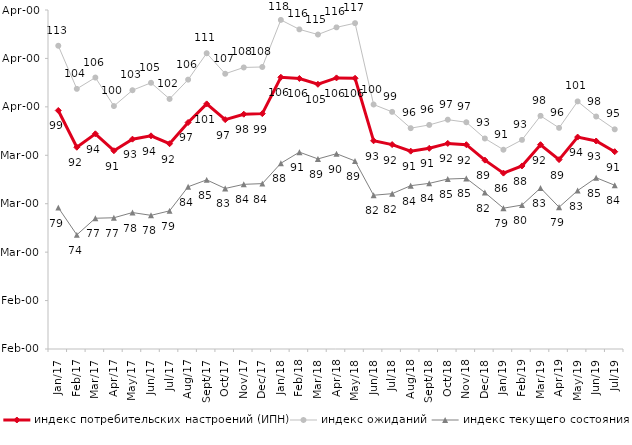
| Category | индекс потребительских настроений (ИПН) | Series 0 | индекс ожиданий | Series 3 | индекс текущего состояния |
|---|---|---|---|---|---|
| 2017-01-01 | 99.25 | 2017-01-01 | 112.617 | 2017-01-01 | 79.2 |
| 2017-02-01 | 91.66 | 2017-02-01 | 103.717 | 2017-02-01 | 73.575 |
| 2017-03-01 | 94.43 | 2017-03-01 | 106.05 | 2017-03-01 | 77 |
| 2017-04-01 | 90.94 | 2017-04-01 | 100.167 | 2017-04-01 | 77.1 |
| 2017-05-01 | 93.33 | 2017-05-01 | 103.433 | 2017-05-01 | 78.175 |
| 2017-06-01 | 94.02 | 2017-06-01 | 104.967 | 2017-06-01 | 77.6 |
| 2017-07-01 | 92.39 | 2017-07-01 | 101.633 | 2017-07-01 | 78.525 |
| 2017-08-01 | 96.77 | 2017-08-01 | 105.617 | 2017-08-01 | 83.5 |
| 2017-09-01 | 100.61 | 2017-09-01 | 111.067 | 2017-09-01 | 84.925 |
| 2017-10-01 | 97.36 | 2017-10-01 | 106.833 | 2017-10-01 | 83.15 |
| 2017-11-01 | 98.48 | 2017-11-01 | 108.133 | 2017-11-01 | 84 |
| 2017-12-01 | 98.6 | 2017-12-01 | 108.233 | 2017-12-01 | 84.15 |
| 2018-01-01 | 106.11 | 2018-01-01 | 117.95 | 2018-01-01 | 88.35 |
| 2018-02-01 | 105.86 | 2018-02-01 | 116 | 2018-02-01 | 90.65 |
| 2018-03-01 | 104.66 | 2018-03-01 | 114.933 | 2018-03-01 | 89.25 |
| 2018-04-01 | 105.98 | 2018-04-01 | 116.417 | 2018-04-01 | 90.325 |
| 2018-05-01 | 105.9 | 2018-05-01 | 117.283 | 2018-05-01 | 88.825 |
| 2018-06-01 | 92.99 | 2018-06-01 | 100.483 | 2018-06-01 | 81.75 |
| 2018-07-01 | 92.21 | 2018-07-01 | 98.967 | 2018-07-01 | 82.075 |
| 2018-08-01 | 90.85 | 2018-08-01 | 95.6 | 2018-08-01 | 83.725 |
| 2018-09-01 | 91.44 | 2018-09-01 | 96.267 | 2018-09-01 | 84.2 |
| 2018-10-01 | 92.45 | 2018-10-01 | 97.35 | 2018-10-01 | 85.1 |
| 2018-11-01 | 92.186 | 2018-11-01 | 96.823 | 2018-11-01 | 85.23 |
| 2018-12-01 | 89 | 2018-12-01 | 93.467 | 2018-12-01 | 82.3 |
| 2019-01-01 | 86.32 | 2019-01-01 | 91.15 | 2019-01-01 | 79.075 |
| 2019-02-01 | 87.8 | 2019-02-01 | 93.183 | 2019-02-01 | 79.725 |
| 2019-03-01 | 92.183 | 2019-03-01 | 98.144 | 2019-03-01 | 83.242 |
| 2019-04-01 | 89.109 | 2019-04-01 | 95.66 | 2019-04-01 | 79.282 |
| 2019-05-01 | 93.759 | 2019-05-01 | 101.123 | 2019-05-01 | 82.714 |
| 2019-06-01 | 92.948 | 2019-06-01 | 98.005 | 2019-06-01 | 85.362 |
| 2019-07-01 | 90.743 | 2019-07-01 | 95.363 | 2019-07-01 | 83.812 |